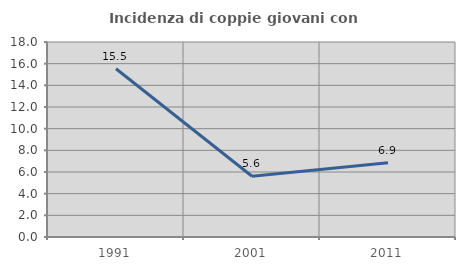
| Category | Incidenza di coppie giovani con figli |
|---|---|
| 1991.0 | 15.534 |
| 2001.0 | 5.607 |
| 2011.0 | 6.863 |